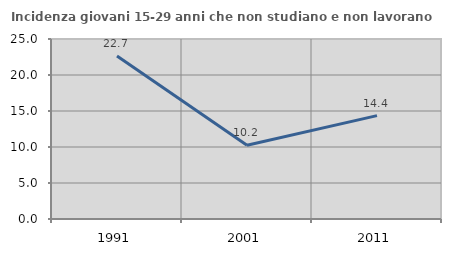
| Category | Incidenza giovani 15-29 anni che non studiano e non lavorano  |
|---|---|
| 1991.0 | 22.653 |
| 2001.0 | 10.237 |
| 2011.0 | 14.359 |